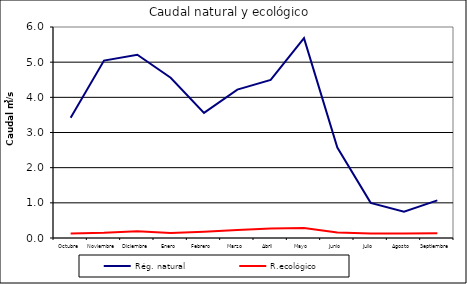
| Category | Rég. natural | R.ecológico |
|---|---|---|
| Octubre | 3.419 | 0.128 |
| Noviembre | 5.044 | 0.146 |
| Diciembre | 5.212 | 0.19 |
| Enero | 4.556 | 0.139 |
| Febrero | 3.558 | 0.181 |
| Marzo | 4.22 | 0.231 |
| Abril | 4.497 | 0.271 |
| Mayo | 5.682 | 0.285 |
| Junio | 2.572 | 0.155 |
| Julio | 0.999 | 0.128 |
| Agosto | 0.75 | 0.128 |
| Septiembre | 1.07 | 0.135 |